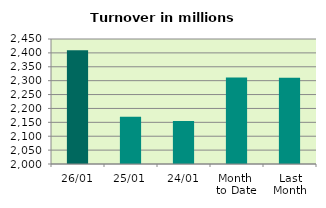
| Category | Series 0 |
|---|---|
| 26/01 | 2409.055 |
| 25/01 | 2170.016 |
| 24/01 | 2155.154 |
| Month 
to Date | 2311.328 |
| Last
Month | 2310.602 |